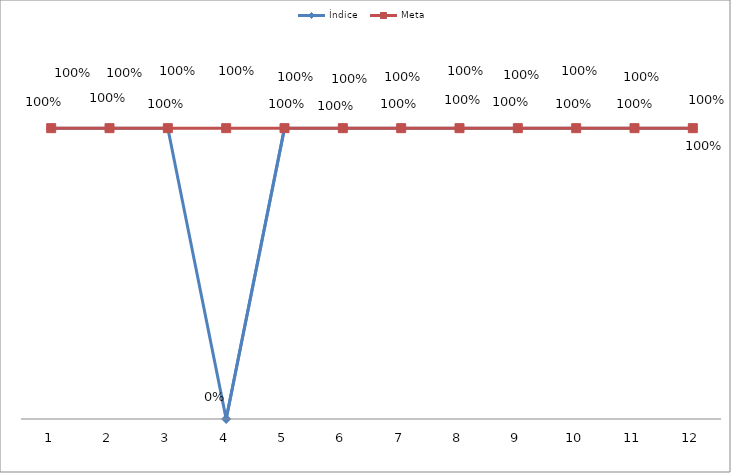
| Category | Índice | Meta |
|---|---|---|
| 0 | 1 | 1 |
| 1 | 1 | 1 |
| 2 | 1 | 1 |
| 3 | 0 | 1 |
| 4 | 1 | 1 |
| 5 | 1 | 1 |
| 6 | 1 | 1 |
| 7 | 1 | 1 |
| 8 | 1 | 1 |
| 9 | 1 | 1 |
| 10 | 1 | 1 |
| 11 | 1 | 1 |